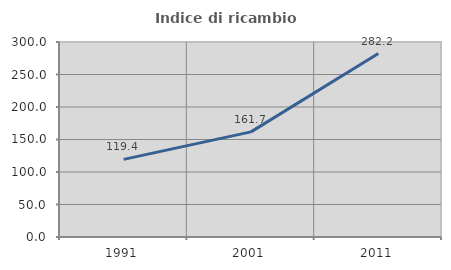
| Category | Indice di ricambio occupazionale  |
|---|---|
| 1991.0 | 119.424 |
| 2001.0 | 161.706 |
| 2011.0 | 282.216 |